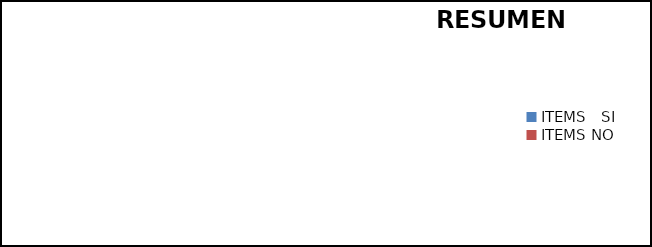
| Category | RESUMEN ESTADISTICO |
|---|---|
| ITEMS   SI | 0 |
| ITEMS NO | 0 |